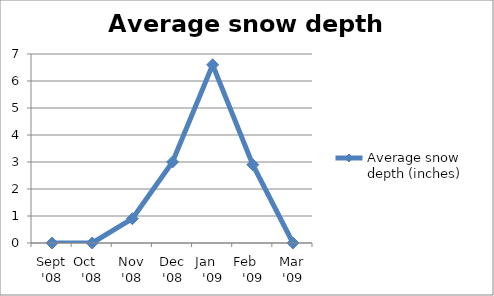
| Category | Average snow depth (inches) |
|---|---|
| Sept '08 | 0 |
| Oct    '08 | 0 |
| Nov '08 | 0.9 |
| Dec '08 | 3 |
| Jan    '09 | 6.6 |
| Feb    '09 | 2.9 |
| Mar '09 | 0 |